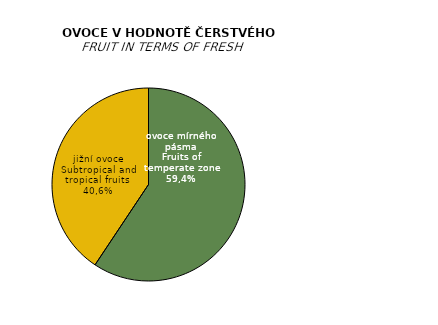
| Category | 2015 |
|---|---|
| ovoce mírného pásma | 48.9 |
| jižní ovoce  | 33.5 |